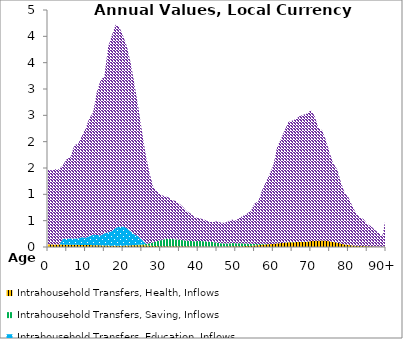
| Category | Intrahousehold Transfers, Health, Inflows | Intrahousehold Transfers, Saving, Inflows | Intrahousehold Transfers, Education, Inflows | Intrahousehold Transfers, Consumption other than health and education, Inflows |
|---|---|---|---|---|
| 0 | 52.624 | 0 | 0 | 1415.544 |
|  | 49.642 | 0 | 0 | 1405.685 |
| 2 | 47.986 | 0 | 0 | 1429.277 |
| 3 | 46.482 | 0 | 0 | 1431.864 |
| 4 | 45.177 | 0 | 111.119 | 1403.743 |
| 5 | 43.898 | 0 | 114.604 | 1511.611 |
| 6 | 42.8 | 0 | 119.223 | 1546.857 |
| 7 | 41.711 | 0 | 119.872 | 1772.193 |
| 8 | 40.581 | 0 | 122.967 | 1794.455 |
| 9 | 39.188 | 0 | 147.971 | 1922.362 |
| 10 | 38.078 | 0 | 138.312 | 2072.295 |
| 11 | 36.536 | 0 | 166.686 | 2242.473 |
| 12 | 34.964 | 0 | 198.372 | 2320.057 |
| 13 | 33.032 | 0 | 196.238 | 2713.674 |
| 14 | 30.915 | 0 | 188.274 | 2949.541 |
| 15 | 28.206 | 0 | 228.149 | 2982.703 |
| 16 | 26.249 | 0 | 251.226 | 3520.306 |
| 17 | 24.942 | 0 | 274.212 | 3720.612 |
| 18 | 25.075 | 0 | 340.24 | 3856.155 |
| 19 | 24.861 | 0 | 360.997 | 3791.169 |
| 20 | 25.592 | 0 | 365.296 | 3615.773 |
| 21 | 27.426 | 0.529 | 329.506 | 3452.272 |
| 22 | 30.469 | 1.945 | 264.169 | 3201.581 |
| 23 | 33.407 | 2.81 | 204.442 | 2865.596 |
| 24 | 33.792 | 8.778 | 162.495 | 2470.361 |
| 25 | 33.266 | 16.051 | 86.532 | 2069.238 |
| 26 | 30.757 | 24.63 | 9.74 | 1696.355 |
| 27 | 25.553 | 44.352 | 0 | 1345.442 |
| 28 | 19.856 | 66.947 | 0 | 1059.367 |
| 29 | 17.454 | 93.663 | 0 | 947.426 |
| 30 | 15.514 | 112.412 | 0 | 865.948 |
| 31 | 14.542 | 133.375 | 0 | 816.175 |
| 32 | 14.9 | 136.719 | 0 | 794.284 |
| 33 | 14.523 | 137.408 | 0 | 737.71 |
| 34 | 15.697 | 128.234 | 0 | 731.181 |
| 35 | 15.417 | 123.828 | 0 | 682.223 |
| 36 | 14.811 | 113.727 | 0 | 628.348 |
| 37 | 12.835 | 108.255 | 0 | 552.744 |
| 38 | 11.994 | 104.078 | 0 | 520.366 |
| 39 | 10.062 | 99.26 | 0 | 458.03 |
| 40 | 9.552 | 103.481 | 0 | 436.533 |
| 41 | 9.268 | 103.03 | 0 | 420.861 |
| 42 | 8.685 | 98.419 | 0 | 401.657 |
| 43 | 8.404 | 89.992 | 0 | 379.16 |
| 44 | 9.226 | 83.551 | 0 | 381.206 |
| 45 | 11.292 | 71.21 | 0 | 405.784 |
| 46 | 10.99 | 60.55 | 0 | 393.628 |
| 47 | 11.116 | 57.123 | 0 | 390.519 |
| 48 | 12.162 | 56.591 | 0 | 414.249 |
| 49 | 13.425 | 61.798 | 0 | 445.781 |
| 50 | 12.248 | 58.905 | 0 | 434.65 |
| 51 | 14.123 | 59.482 | 0 | 481.314 |
| 52 | 16.105 | 52.46 | 0 | 525.803 |
| 53 | 18.199 | 47.865 | 0 | 569.263 |
| 54 | 21.562 | 38.152 | 0 | 625.14 |
| 55 | 29.904 | 29.629 | 0 | 766.103 |
| 56 | 33.449 | 20.219 | 0 | 814.672 |
| 57 | 43.635 | 17.049 | 0 | 1018.216 |
| 58 | 49.381 | 10.603 | 0 | 1171.507 |
| 59 | 53.5 | 3.641 | 0 | 1330.416 |
| 60 | 57.277 | 2.053 | 0 | 1495.666 |
| 61 | 69.053 | 1.518 | 0 | 1826.191 |
| 62 | 73.646 | 0.614 | 0 | 1974.349 |
| 63 | 80.951 | 0.235 | 0 | 2130.011 |
| 64 | 89.168 | 3.23 | 0 | 2281.574 |
| 65 | 91.328 | 4.221 | 0 | 2302.912 |
| 66 | 92.515 | 4.257 | 0 | 2333.592 |
| 67 | 95.14 | 3.944 | 0 | 2387.975 |
| 68 | 95.849 | 3.85 | 0 | 2411.395 |
| 69 | 101.064 | 0.797 | 0 | 2432.844 |
| 70 | 112.214 | 0 | 0 | 2484.753 |
| 71 | 118.065 | 0 | 0 | 2370.758 |
| 72 | 116.253 | 0.072 | 0 | 2143.939 |
| 73 | 125.354 | 0.069 | 0 | 2090.025 |
| 74 | 120.118 | 0.066 | 0 | 1909.221 |
| 75 | 108.409 | 0.063 | 0 | 1678.69 |
| 76 | 94.546 | 0.058 | 0 | 1487.528 |
| 77 | 83.974 | 0 | 0 | 1390.618 |
| 78 | 64.019 | 0 | 0 | 1163.436 |
| 79 | 49.403 | 0 | 0 | 976.341 |
| 80 | 39.811 | 0 | 0 | 902.257 |
| 81 | 30.406 | 0 | 0 | 752.921 |
| 82 | 23.201 | 0 | 0 | 622.943 |
| 83 | 19.384 | 0 | 0 | 542.025 |
| 84 | 18.119 | 0 | 0 | 512.698 |
| 85 | 14.821 | 0 | 0 | 421.64 |
| 86 | 13.099 | 0 | 0 | 382.471 |
| 87 | 10.402 | 0 | 0 | 313.874 |
| 88 | 7.823 | 0 | 0 | 266.537 |
| 89 | 4.816 | 0 | 0 | 200.226 |
| 90+ | 9.891 | 0 | 0 | 568.203 |